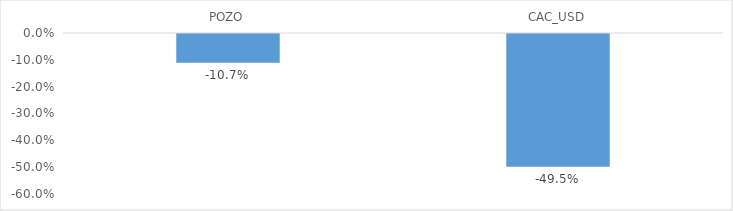
| Category | Series 0 |
|---|---|
| POZO | -0.107 |
| CAC_USD | -0.495 |